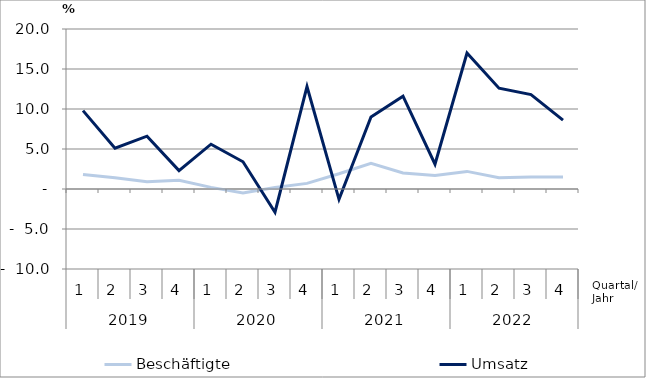
| Category | Beschäftigte | Umsatz |
|---|---|---|
| 0 | 1.8 | 9.8 |
| 1 | 1.4 | 5.1 |
| 2 | 0.9 | 6.6 |
| 3 | 1.1 | 2.3 |
| 4 | 0.2 | 5.6 |
| 5 | -0.5 | 3.4 |
| 6 | 0.2 | -2.9 |
| 7 | 0.7 | 12.8 |
| 8 | 1.9 | -1.3 |
| 9 | 3.2 | 9 |
| 10 | 2 | 11.6 |
| 11 | 1.7 | 3.1 |
| 12 | 2.2 | 17 |
| 13 | 1.4 | 12.6 |
| 14 | 1.5 | 11.8 |
| 15 | 1.5 | 8.6 |